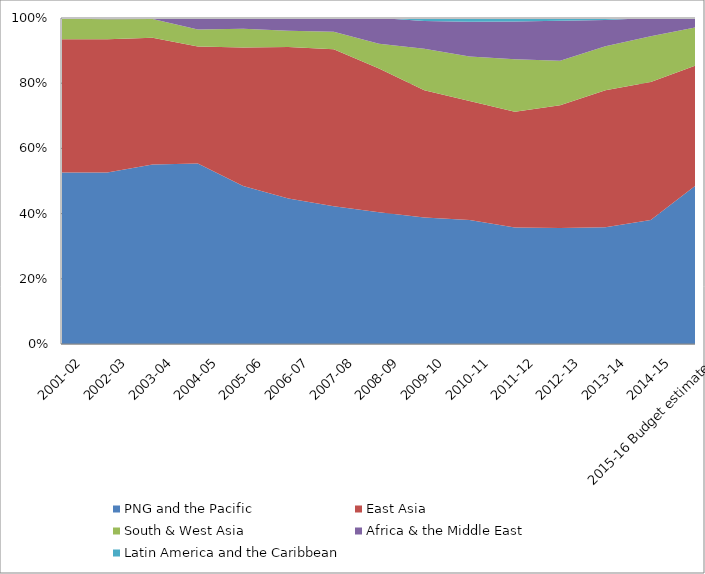
| Category | PNG and the Pacific | East Asia | South & West Asia | Africa & the Middle East | Latin America and the Caribbean |
|---|---|---|---|---|---|
|  2001-02  | 0.495 | 0.384 | 0.059 | 0.002 | 0 |
|  2002-03  | 0.496 | 0.386 | 0.058 | 0.003 | 0 |
|  2003-04  | 0.524 | 0.37 | 0.055 | 0.003 | 0 |
|  2004-05  | 0.544 | 0.352 | 0.051 | 0.034 | 0 |
|  2005-06  | 0.485 | 0.425 | 0.057 | 0.033 | 0 |
|  2006-07  | 0.447 | 0.464 | 0.05 | 0.039 | 0 |
|  2007-08  | 0.422 | 0.482 | 0.054 | 0.042 | 0 |
|  2008-09  | 0.404 | 0.441 | 0.075 | 0.079 | 0 |
|  2009-10  | 0.388 | 0.39 | 0.127 | 0.086 | 0.009 |
|  2010-11  | 0.381 | 0.365 | 0.136 | 0.106 | 0.012 |
|  2011-12  | 0.357 | 0.355 | 0.162 | 0.115 | 0.011 |
|  2012-13  | 0.356 | 0.377 | 0.137 | 0.122 | 0.008 |
|  2013-14  | 0.358 | 0.42 | 0.135 | 0.081 | 0.006 |
| 2014-15 | 0.381 | 0.423 | 0.14 | 0.056 | 0 |
|  2015-16 Budget estimate  | 0.487 | 0.368 | 0.117 | 0.028 | 0 |